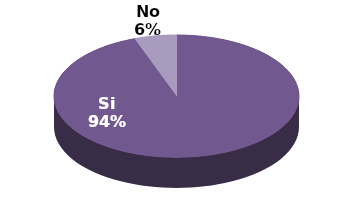
| Category | Series 1 |
|---|---|
| Si | 17 |
| No | 1 |